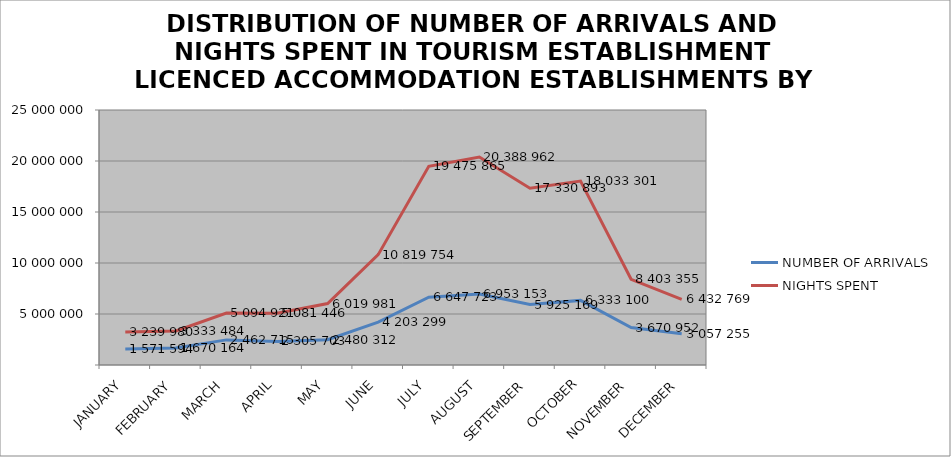
| Category | NUMBER OF ARRIVALS | NIGHTS SPENT |
|---|---|---|
| JANUARY | 1571594 | 3239980 |
| FEBRUARY | 1670164 | 3333484 |
| MARCH | 2462715 | 5094921 |
| APRIL | 2305703 | 5081446 |
| MAY | 2480312 | 6019981 |
| JUNE | 4203299 | 10819754 |
| JULY | 6647723 | 19475865 |
| AUGUST | 6953153 | 20388962 |
| SEPTEMBER | 5925169 | 17330893 |
| OCTOBER | 6333100 | 18033301 |
| NOVEMBER | 3670952 | 8403355 |
| DECEMBER | 3057255 | 6432769 |